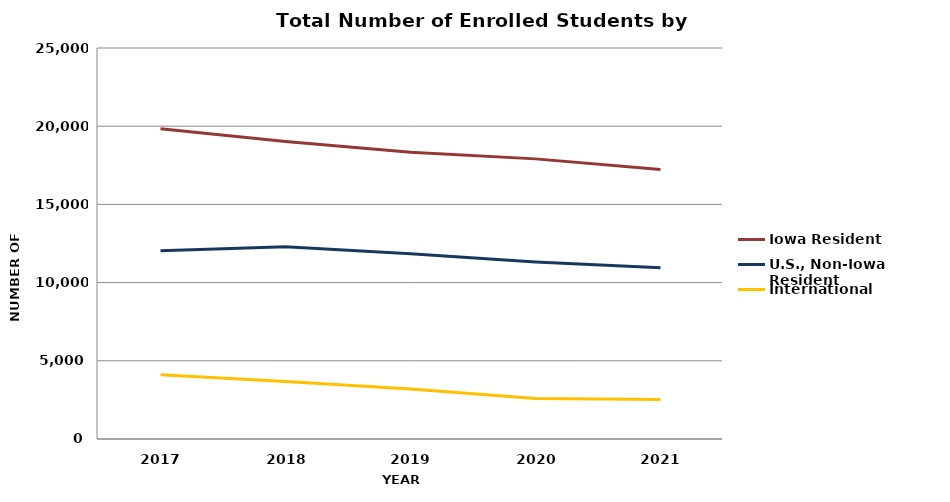
| Category | Iowa Resident | U.S., Non-Iowa Resident | International |
|---|---|---|---|
| 2017.0 | 19843 | 12035 | 4115 |
| 2018.0 | 19022 | 12299 | 3671 |
| 2019.0 | 18341 | 11852 | 3198 |
| 2020.0 | 17911 | 11322 | 2592 |
| 2021.0 | 17232 | 10944 | 2532 |